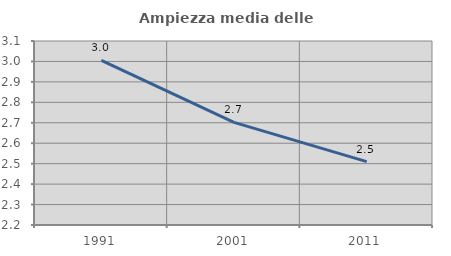
| Category | Ampiezza media delle famiglie |
|---|---|
| 1991.0 | 3.005 |
| 2001.0 | 2.702 |
| 2011.0 | 2.51 |